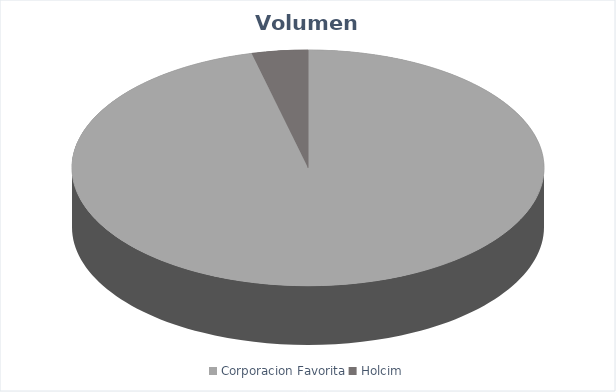
| Category | VOLUMEN ($USD) |
|---|---|
| Corporacion Favorita | 170725.24 |
| Holcim | 6800 |